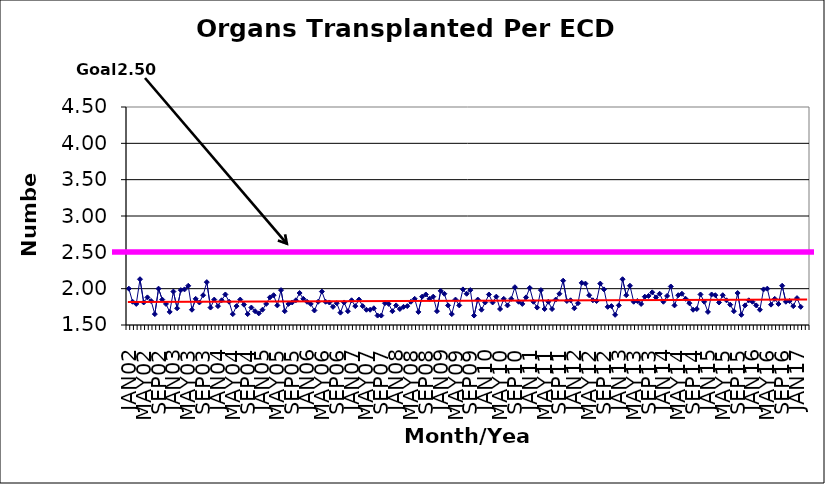
| Category | Series 0 |
|---|---|
| JAN02 | 2 |
| FEB02 | 1.82 |
| MAR02 | 1.79 |
| APR02 | 2.13 |
| MAY02 | 1.81 |
| JUN02 | 1.88 |
| JUL02 | 1.83 |
| AUG02 | 1.65 |
| SEP02 | 2 |
| OCT02 | 1.85 |
| NOV02 | 1.79 |
| DEC02 | 1.68 |
| JAN03 | 1.96 |
| FEB03 | 1.73 |
| MAR03 | 1.98 |
| APR03 | 1.99 |
| MAY03 | 2.04 |
| JUN03 | 1.71 |
| JUL03 | 1.86 |
| AUG03 | 1.81 |
| SEP03 | 1.91 |
| OCT03 | 2.09 |
| NOV03 | 1.74 |
| DEC03 | 1.85 |
| JAN04 | 1.76 |
| FEB04 | 1.84 |
| MAR04 | 1.92 |
| APR04 | 1.82 |
| MAY04 | 1.65 |
| JUN04 | 1.76 |
| JUL04 | 1.85 |
| AUG04 | 1.78 |
| SEP04 | 1.65 |
| OCT04 | 1.74 |
| NOV04 | 1.69 |
| DEC04 | 1.66 |
| JAN05 | 1.71 |
| FEB05 | 1.79 |
| MAR05 | 1.88 |
| APR05 | 1.91 |
| MAY05 | 1.77 |
| JUN05 | 1.98 |
| JUL05 | 1.69 |
| AUG05 | 1.79 |
| SEP05 | 1.81 |
| OCT05 | 1.84 |
| NOV05 | 1.94 |
| DEC05 | 1.86 |
| JAN06 | 1.82 |
| FEB06 | 1.79 |
| MAR06 | 1.7 |
| APR06 | 1.82 |
| MAY06 | 1.96 |
| JUN06 | 1.82 |
| JUL06 | 1.81 |
| AUG06 | 1.75 |
| SEP06 | 1.8 |
| OCT06 | 1.67 |
| NOV06 | 1.81 |
| DEC06 | 1.69 |
| JAN07 | 1.84 |
| FEB07 | 1.76 |
| MAR07 | 1.85 |
| APR07 | 1.76 |
| MAY07 | 1.71 |
| JUN07 | 1.71 |
| JUL07 | 1.73 |
| AUG07 | 1.63 |
| SEP07 | 1.63 |
| OCT07 | 1.8 |
| NOV07 | 1.79 |
| DEC07 | 1.69 |
| JAN08 | 1.77 |
| FEB08 | 1.72 |
| MAR08 | 1.75 |
| APR08 | 1.76 |
| MAY08 | 1.82 |
| JUN08 | 1.86 |
| JUL08 | 1.68 |
| AUG08 | 1.89 |
| SEP08 | 1.92 |
| OCT08 | 1.86 |
| NOV08 | 1.89 |
| DEC08 | 1.69 |
| JAN09 | 1.97 |
| FEB09 | 1.93 |
| MAR09 | 1.77 |
| APR09 | 1.65 |
| MAY09 | 1.85 |
| JUN09 | 1.77 |
| JUL09 | 1.99 |
| AUG09 | 1.93 |
| SEP09 | 1.98 |
| OCT09 | 1.63 |
| NOV09 | 1.85 |
| DEC09 | 1.71 |
| JAN10 | 1.81 |
| FEB10 | 1.92 |
| MAR10 | 1.81 |
| APR10 | 1.89 |
| MAY10 | 1.72 |
| JUN10 | 1.86 |
| JUL10 | 1.77 |
| AUG10 | 1.86 |
| SEP10 | 2.02 |
| OCT10 | 1.82 |
| NOV10 | 1.79 |
| DEC10 | 1.88 |
| JAN11 | 2.01 |
| FEB11 | 1.82 |
| MAR11 | 1.74 |
| APR11 | 1.98 |
| MAY11 | 1.72 |
| JUN11 | 1.82 |
| JUL11 | 1.72 |
| AUG11 | 1.85 |
| SEP11 | 1.93 |
| OCT11 | 2.11 |
| NOV11 | 1.83 |
| DEC11 | 1.84 |
| JAN12 | 1.73 |
| FEB12 | 1.8 |
| MAR12 | 2.08 |
| APR12 | 2.07 |
| MAY12 | 1.91 |
| JUN12 | 1.84 |
| JUL12 | 1.83 |
| AUG12 | 2.07 |
| SEP12 | 1.99 |
| OCT12 | 1.75 |
| NOV12 | 1.76 |
| DEC12 | 1.64 |
| JAN13 | 1.77 |
| FEB13 | 2.13 |
| MAR13 | 1.91 |
| APR13 | 2.04 |
| MAY13 | 1.82 |
| JUN13 | 1.83 |
| JUL13 | 1.79 |
| AUG13 | 1.89 |
| SEP13 | 1.9 |
| OCT13 | 1.95 |
| NOV13 | 1.88 |
| DEC13 | 1.93 |
| JAN14 | 1.82 |
| FEB14 | 1.9 |
| MAR14 | 2.03 |
| APR14 | 1.77 |
| MAY14 | 1.91 |
| JUN14 | 1.93 |
| JUL14 | 1.86 |
| AUG14 | 1.8 |
| SEP14 | 1.71 |
| OCT14 | 1.72 |
| NOV14 | 1.92 |
| DEC14 | 1.82 |
| JAN15 | 1.68 |
| FEB15 | 1.92 |
| MAR15 | 1.91 |
| APR15 | 1.81 |
| MAY15 | 1.91 |
| JUN15 | 1.84 |
| JUL15 | 1.78 |
| AUG15 | 1.69 |
| SEP15 | 1.94 |
| OCT15 | 1.64 |
| NOV15 | 1.77 |
| DEC15 | 1.84 |
| JAN16 | 1.82 |
| FEB16 | 1.77 |
| MAR16 | 1.71 |
| APR16 | 1.99 |
| MAY16 | 2 |
| JUN16 | 1.78 |
| JUL16 | 1.86 |
| AUG16 | 1.79 |
| SEP16 | 2.04 |
| OCT16 | 1.82 |
| NOV16 | 1.83 |
| DEC16 | 1.76 |
| JAN17 | 1.87 |
| FEB17 | 1.75 |